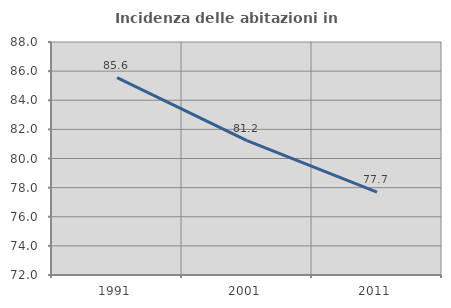
| Category | Incidenza delle abitazioni in proprietà  |
|---|---|
| 1991.0 | 85.56 |
| 2001.0 | 81.229 |
| 2011.0 | 77.698 |